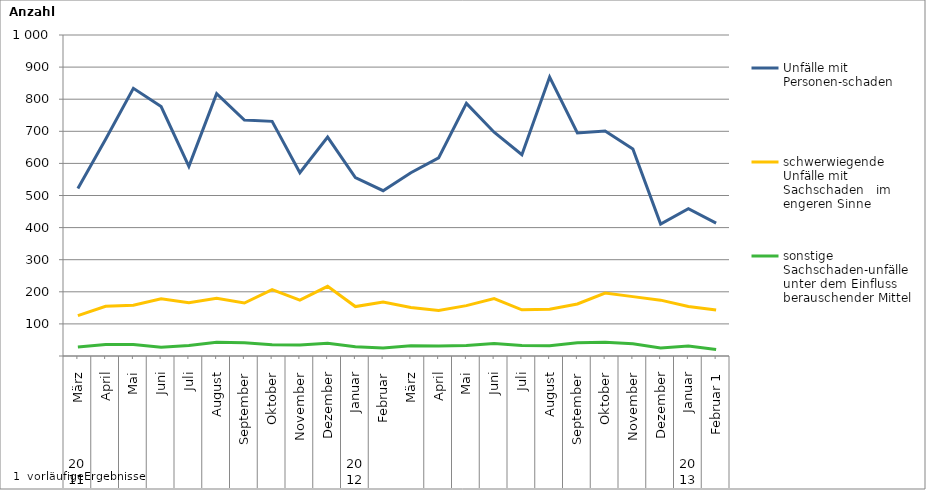
| Category | Unfälle mit Personen-schaden | schwerwiegende Unfälle mit Sachschaden   im engeren Sinne | sonstige Sachschaden-unfälle unter dem Einfluss berauschender Mittel |
|---|---|---|---|
| 0 | 522 | 126 | 28 |
| 1 | 675 | 155 | 36 |
| 2 | 834 | 158 | 36 |
| 3 | 777 | 178 | 27 |
| 4 | 591 | 166 | 33 |
| 5 | 817 | 180 | 43 |
| 6 | 735 | 165 | 41 |
| 7 | 731 | 207 | 35 |
| 8 | 571 | 174 | 34 |
| 9 | 682 | 217 | 40 |
| 10 | 556 | 154 | 29 |
| 11 | 515 | 168 | 25 |
| 12 | 571 | 151 | 32 |
| 13 | 617 | 142 | 31 |
| 14 | 787 | 157 | 33 |
| 15 | 697 | 179 | 39 |
| 16 | 627 | 144 | 33 |
| 17 | 869 | 146 | 32 |
| 18 | 695 | 162 | 41 |
| 19 | 701 | 196 | 43 |
| 20 | 645 | 185 | 38 |
| 21 | 411 | 174 | 25 |
| 22 | 459 | 154 | 31 |
| 23 | 414 | 143 | 20 |